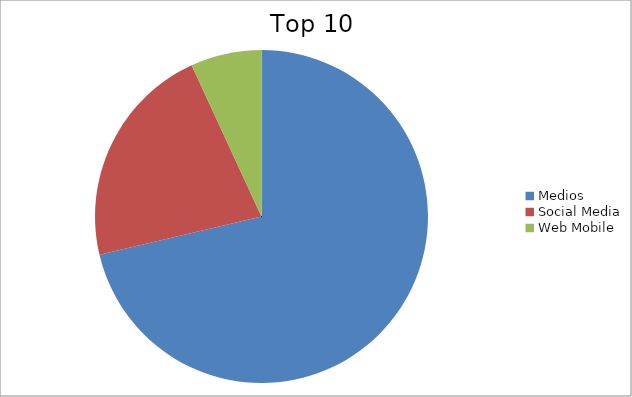
| Category | Series 0 |
|---|---|
| Medios | 71.31 |
| Social Media | 21.8 |
| Web Mobile | 6.89 |